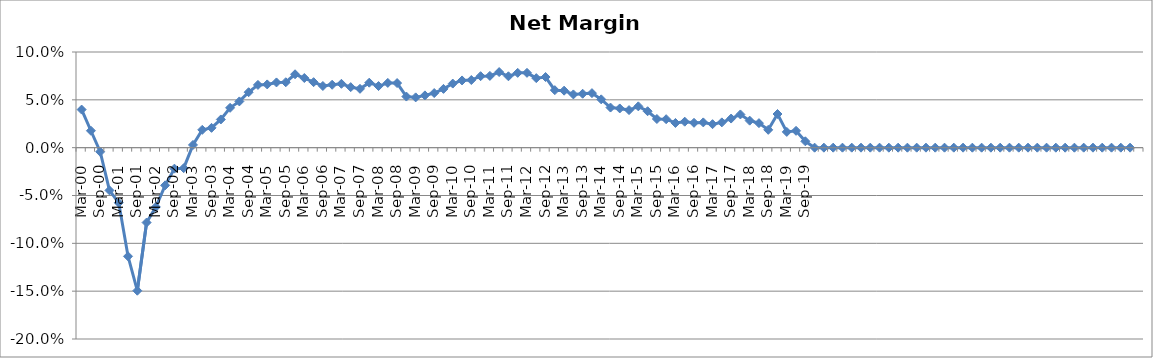
| Category | Series 0 |
|---|---|
| Mar-00 | 0.04 |
| Jun-00 | 0.018 |
| Sep-00 | -0.004 |
| Dec-00 | -0.045 |
| Mar-01 | -0.058 |
| Jun-01 | -0.114 |
| Sep-01 | -0.15 |
| Dec-01 | -0.078 |
| Mar-02 | -0.062 |
| Jun-02 | -0.039 |
| Sep-02 | -0.022 |
| Dec-02 | -0.021 |
| Mar-03 | 0.003 |
| Jun-03 | 0.019 |
| Sep-03 | 0.021 |
| Dec-03 | 0.029 |
| Mar-04 | 0.042 |
| Jun-04 | 0.048 |
| Sep-04 | 0.058 |
| Dec-04 | 0.066 |
| Mar-05 | 0.066 |
| Jun-05 | 0.068 |
| Sep-05 | 0.068 |
| Dec-05 | 0.077 |
| Mar-06 | 0.073 |
| Jun-06 | 0.068 |
| Sep-06 | 0.064 |
| Dec-06 | 0.066 |
| Mar-07 | 0.067 |
| Jun-07 | 0.063 |
| Sep-07 | 0.062 |
| Dec-07 | 0.068 |
| Mar-08 | 0.064 |
| Jun-08 | 0.068 |
| Sep-08 | 0.068 |
| Dec-08 | 0.053 |
| Mar-09 | 0.053 |
| Jun-09 | 0.055 |
| Sep-09 | 0.057 |
| Dec-09 | 0.061 |
| Mar-10 | 0.067 |
| Jun-10 | 0.07 |
| Sep-10 | 0.071 |
| Dec-10 | 0.075 |
| Mar-11 | 0.075 |
| Jun-11 | 0.079 |
| Sep-11 | 0.075 |
| Dec-11 | 0.078 |
| Mar-12 | 0.078 |
| Jun-12 | 0.073 |
| Sep-12 | 0.074 |
| Dec-12 | 0.06 |
| Mar-13 | 0.06 |
| Jun-13 | 0.056 |
| Sep-13 | 0.056 |
| Dec-13 | 0.057 |
| Mar-14 | 0.051 |
| Jun-14 | 0.042 |
| Sep-14 | 0.041 |
| Dec-14 | 0.039 |
| Mar-15 | 0.043 |
| Jun-15 | 0.038 |
| Sep-15 | 0.03 |
| Dec-15 | 0.03 |
| Mar-16 | 0.026 |
| Jun-16 | 0.027 |
| Sep-16 | 0.026 |
| Dec-16 | 0.026 |
| Mar-17 | 0.025 |
| Jun-17 | 0.026 |
| Sep-17 | 0.03 |
| Dec-17 | 0.035 |
| Mar-18 | 0.028 |
| Jun-18 | 0.026 |
| Sep-18 | 0.019 |
| Dec-18 | 0.035 |
| Mar-19 | 0.016 |
| Jun-19 | 0.018 |
| Sep-19 | 0.007 |